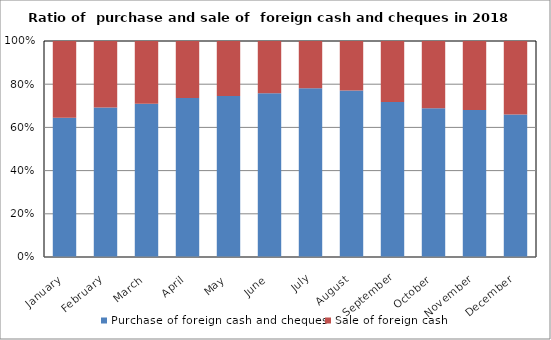
| Category | Purchase of foreign cash and cheques | Sale of foreign cash  |
|---|---|---|
| January | 947540227 | 521917974 |
| February | 969946147 | 431331112 |
| March | 1448668108 | 593064372 |
| April | 1714440597 | 615773602 |
| May | 2000445362 | 683195254 |
| June | 2183391679 | 697052934 |
| July | 3396544866 | 952169225 |
| August | 3414757136 | 1015432371 |
| September | 1886329785 | 743269973 |
| October | 1465132012 | 663903093 |
| November | 1173533478 | 551516744 |
| December | 1352501950 | 698289983 |